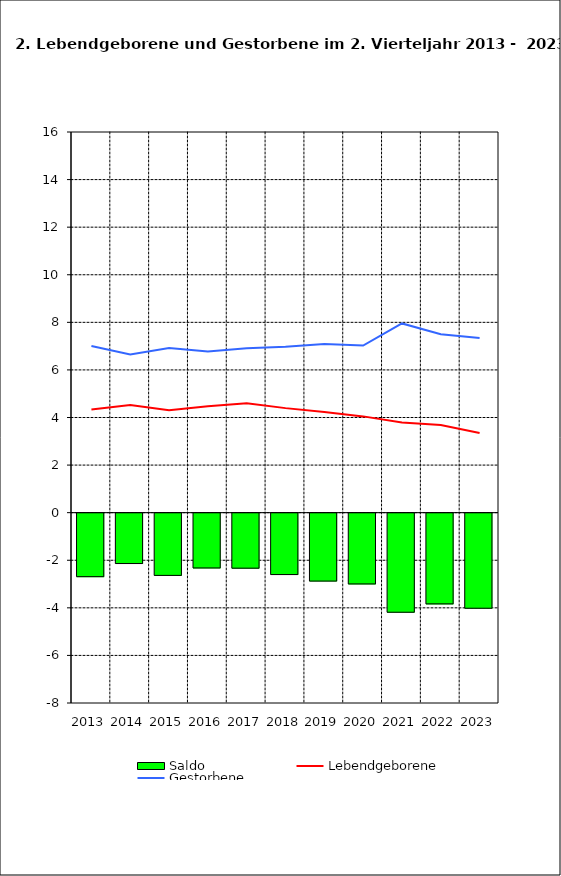
| Category | Saldo |
|---|---|
| 2013.0 | -2.669 |
| 2014.0 | -2.117 |
| 2015.0 | -2.616 |
| 2016.0 | -2.303 |
| 2017.0 | -2.312 |
| 2018.0 | -2.581 |
| 2019.0 | -2.855 |
| 2020.0 | -2.975 |
| 2021.0 | -4.164 |
| 2022.0 | -3.813 |
| 2023.0 | -3.996 |